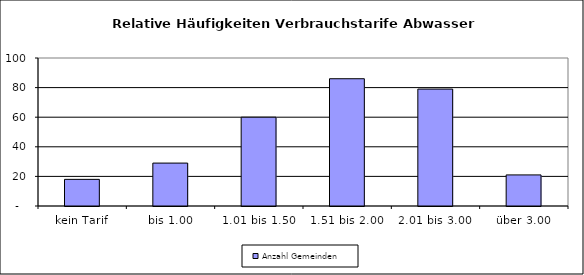
| Category | Anzahl Gemeinden |
|---|---|
| kein Tarif | 18 |
| bis 1.00 | 29 |
| 1.01 bis 1.50 | 60 |
| 1.51 bis 2.00 | 86 |
| 2.01 bis 3.00 | 79 |
| über 3.00 | 21 |